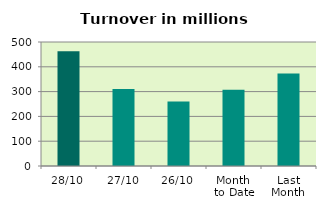
| Category | Series 0 |
|---|---|
| 28/10 | 462.481 |
| 27/10 | 310.391 |
| 26/10 | 259.775 |
| Month 
to Date | 307.482 |
| Last
Month | 372.713 |